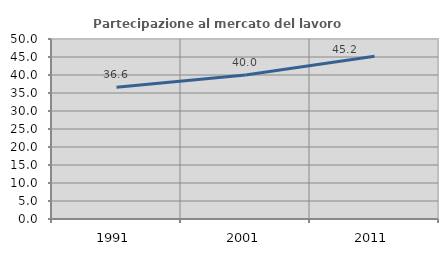
| Category | Partecipazione al mercato del lavoro  femminile |
|---|---|
| 1991.0 | 36.622 |
| 2001.0 | 39.992 |
| 2011.0 | 45.203 |